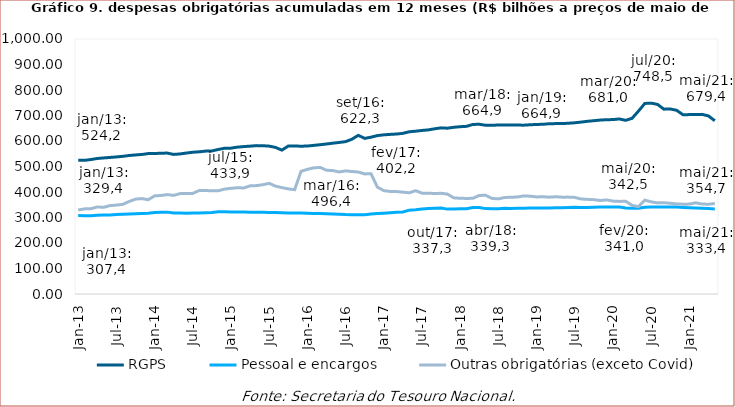
| Category | RGPS | Pessoal e encargos | Outras obrigatórias (exceto Covid) |
|---|---|---|---|
| 2013-01-01 | 524.179 | 307.448 | 329.358 |
| 2013-02-01 | 524.052 | 307.118 | 333.791 |
| 2013-03-01 | 527.367 | 307.178 | 334.481 |
| 2013-04-01 | 531.422 | 308.772 | 341.446 |
| 2013-05-01 | 533.59 | 309.513 | 339.885 |
| 2013-06-01 | 535.503 | 310.275 | 346.733 |
| 2013-07-01 | 537.559 | 311.637 | 348.639 |
| 2013-08-01 | 539.824 | 312.634 | 351.513 |
| 2013-09-01 | 543.108 | 313.38 | 362.718 |
| 2013-10-01 | 545.374 | 314.434 | 371.968 |
| 2013-11-01 | 547.181 | 315.24 | 374.182 |
| 2013-12-01 | 550.688 | 316.499 | 369.772 |
| 2014-01-01 | 550.684 | 319.144 | 384.804 |
| 2014-02-01 | 552.29 | 320.195 | 386.266 |
| 2014-03-01 | 552.537 | 321.026 | 389.851 |
| 2014-04-01 | 547.341 | 317.368 | 386.769 |
| 2014-05-01 | 549.317 | 317.293 | 393.733 |
| 2014-06-01 | 552.721 | 316.963 | 394.595 |
| 2014-07-01 | 555.987 | 317.472 | 394.585 |
| 2014-08-01 | 557.619 | 317.875 | 405.708 |
| 2014-09-01 | 560.349 | 318.68 | 405.862 |
| 2014-10-01 | 561.023 | 319.208 | 404.84 |
| 2014-11-01 | 566.811 | 322.218 | 404.741 |
| 2014-12-01 | 571.523 | 322.639 | 411.401 |
| 2015-01-01 | 572.031 | 321.94 | 414.513 |
| 2015-02-01 | 575.918 | 321.686 | 416.597 |
| 2015-03-01 | 578.096 | 321.177 | 415.897 |
| 2015-04-01 | 579.789 | 320.996 | 424.076 |
| 2015-05-01 | 581.889 | 320.814 | 425.106 |
| 2015-06-01 | 581.474 | 320.613 | 428.514 |
| 2015-07-01 | 579.9 | 319.973 | 433.925 |
| 2015-08-01 | 574.841 | 319.203 | 423.027 |
| 2015-09-01 | 564.231 | 318.335 | 417.072 |
| 2015-10-01 | 580.307 | 317.554 | 412.333 |
| 2015-11-01 | 580.53 | 317.808 | 409.149 |
| 2015-12-01 | 579.545 | 317.196 | 480.915 |
| 2016-01-01 | 580.333 | 316.257 | 488.869 |
| 2016-02-01 | 582.844 | 315.831 | 494.762 |
| 2016-03-01 | 585.422 | 315.631 | 496.382 |
| 2016-04-01 | 588.227 | 314.74 | 485.377 |
| 2016-05-01 | 591.453 | 313.676 | 483.943 |
| 2016-06-01 | 594.311 | 312.794 | 478.592 |
| 2016-07-01 | 597.575 | 311.482 | 482.842 |
| 2016-08-01 | 606.966 | 310.884 | 480.391 |
| 2016-09-01 | 622.261 | 310.964 | 478.331 |
| 2016-10-01 | 610.239 | 311.016 | 470.855 |
| 2016-11-01 | 614.978 | 313.61 | 471.755 |
| 2016-12-01 | 621.176 | 315.508 | 419.139 |
| 2017-01-01 | 624.123 | 316.859 | 405.496 |
| 2017-02-01 | 625.919 | 318.67 | 402.186 |
| 2017-03-01 | 627.34 | 320.212 | 401.785 |
| 2017-04-01 | 629.998 | 321.838 | 399.427 |
| 2017-05-01 | 636.206 | 328.746 | 396.866 |
| 2017-06-01 | 638.461 | 330.637 | 405.279 |
| 2017-07-01 | 641.361 | 333.089 | 395.558 |
| 2017-08-01 | 643.584 | 335.029 | 395.475 |
| 2017-09-01 | 647.929 | 336.569 | 393.99 |
| 2017-10-01 | 651.524 | 337.302 | 394.874 |
| 2017-11-01 | 650.225 | 332.923 | 391.855 |
| 2017-12-01 | 653.847 | 333.377 | 377.016 |
| 2018-01-01 | 656.095 | 334.196 | 375.426 |
| 2018-02-01 | 657.546 | 334.275 | 374.748 |
| 2018-03-01 | 664.855 | 338.898 | 375.243 |
| 2018-04-01 | 665.599 | 339.349 | 386.619 |
| 2018-05-01 | 661.711 | 334.85 | 386.956 |
| 2018-06-01 | 662.127 | 334.587 | 374.937 |
| 2018-07-01 | 662.337 | 334.681 | 372.993 |
| 2018-08-01 | 662.543 | 335.795 | 378.591 |
| 2018-09-01 | 663.202 | 335.587 | 379.39 |
| 2018-10-01 | 662.382 | 335.987 | 380.455 |
| 2018-11-01 | 662.162 | 336.095 | 384.759 |
| 2018-12-01 | 663.654 | 337.429 | 383.558 |
| 2019-01-01 | 664.885 | 336.905 | 380.687 |
| 2019-02-01 | 665.566 | 337.338 | 381.277 |
| 2019-03-01 | 667.697 | 337.473 | 379.717 |
| 2019-04-01 | 668.235 | 338.029 | 381.219 |
| 2019-05-01 | 668.202 | 338.372 | 379.823 |
| 2019-06-01 | 669.698 | 339.086 | 379.932 |
| 2019-07-01 | 671.391 | 339.815 | 378.81 |
| 2019-08-01 | 674.188 | 339.081 | 372.524 |
| 2019-09-01 | 677.265 | 339.681 | 371.191 |
| 2019-10-01 | 679.63 | 340.339 | 369.991 |
| 2019-11-01 | 682.021 | 340.887 | 366.609 |
| 2019-12-01 | 683.543 | 341.655 | 369.04 |
| 2020-01-01 | 683.962 | 341.208 | 364.338 |
| 2020-02-01 | 686.429 | 340.952 | 363.093 |
| 2020-03-01 | 681.041 | 336.934 | 363.784 |
| 2020-04-01 | 688.91 | 336.721 | 347.712 |
| 2020-05-01 | 717.075 | 336.677 | 342.545 |
| 2020-06-01 | 747.182 | 340.374 | 368.039 |
| 2020-07-01 | 748.542 | 340.86 | 361.403 |
| 2020-08-01 | 743.449 | 341.158 | 357.282 |
| 2020-09-01 | 724.914 | 341.166 | 357.95 |
| 2020-10-01 | 725.588 | 341.02 | 355.814 |
| 2020-11-01 | 720.461 | 340.768 | 353.245 |
| 2020-12-01 | 703 | 339.416 | 352.293 |
| 2021-01-01 | 703.503 | 338.315 | 352.49 |
| 2021-02-01 | 703.479 | 337.562 | 357.639 |
| 2021-03-01 | 704.434 | 336.283 | 352.81 |
| 2021-04-01 | 698.417 | 334.96 | 352.08 |
| 2021-05-01 | 679.368 | 333.449 | 354.668 |